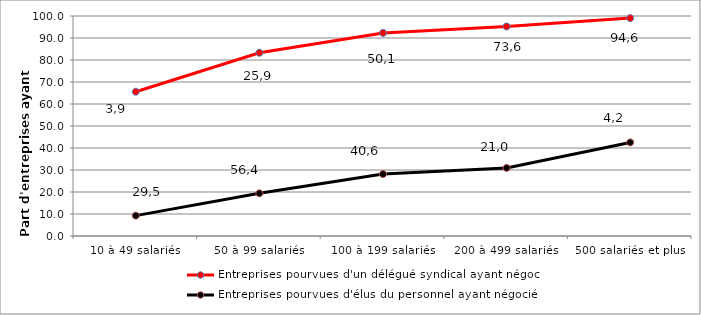
| Category | Entreprises pourvues d'un délégué syndical ayant négocié | Entreprises pourvues d'élus du personnel ayant négocié |
|---|---|---|
| 10 à 49 salariés | 65.584 | 9.259 |
| 50 à 99 salariés | 83.298 | 19.414 |
| 100 à 199 salariés | 92.313 | 28.155 |
| 200 à 499 salariés | 95.239 | 30.95 |
| 500 salariés et plus | 99.055 | 42.536 |